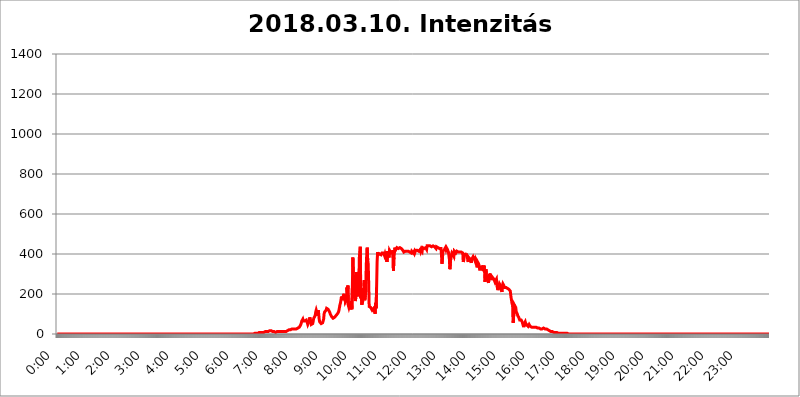
| Category | 2018.03.10. Intenzitás [W/m^2] |
|---|---|
| 0.0 | 0 |
| 0.0006944444444444445 | 0 |
| 0.001388888888888889 | 0 |
| 0.0020833333333333333 | 0 |
| 0.002777777777777778 | 0 |
| 0.003472222222222222 | 0 |
| 0.004166666666666667 | 0 |
| 0.004861111111111111 | 0 |
| 0.005555555555555556 | 0 |
| 0.0062499999999999995 | 0 |
| 0.006944444444444444 | 0 |
| 0.007638888888888889 | 0 |
| 0.008333333333333333 | 0 |
| 0.009027777777777779 | 0 |
| 0.009722222222222222 | 0 |
| 0.010416666666666666 | 0 |
| 0.011111111111111112 | 0 |
| 0.011805555555555555 | 0 |
| 0.012499999999999999 | 0 |
| 0.013194444444444444 | 0 |
| 0.013888888888888888 | 0 |
| 0.014583333333333332 | 0 |
| 0.015277777777777777 | 0 |
| 0.015972222222222224 | 0 |
| 0.016666666666666666 | 0 |
| 0.017361111111111112 | 0 |
| 0.018055555555555557 | 0 |
| 0.01875 | 0 |
| 0.019444444444444445 | 0 |
| 0.02013888888888889 | 0 |
| 0.020833333333333332 | 0 |
| 0.02152777777777778 | 0 |
| 0.022222222222222223 | 0 |
| 0.02291666666666667 | 0 |
| 0.02361111111111111 | 0 |
| 0.024305555555555556 | 0 |
| 0.024999999999999998 | 0 |
| 0.025694444444444447 | 0 |
| 0.02638888888888889 | 0 |
| 0.027083333333333334 | 0 |
| 0.027777777777777776 | 0 |
| 0.02847222222222222 | 0 |
| 0.029166666666666664 | 0 |
| 0.029861111111111113 | 0 |
| 0.030555555555555555 | 0 |
| 0.03125 | 0 |
| 0.03194444444444445 | 0 |
| 0.03263888888888889 | 0 |
| 0.03333333333333333 | 0 |
| 0.034027777777777775 | 0 |
| 0.034722222222222224 | 0 |
| 0.035416666666666666 | 0 |
| 0.036111111111111115 | 0 |
| 0.03680555555555556 | 0 |
| 0.0375 | 0 |
| 0.03819444444444444 | 0 |
| 0.03888888888888889 | 0 |
| 0.03958333333333333 | 0 |
| 0.04027777777777778 | 0 |
| 0.04097222222222222 | 0 |
| 0.041666666666666664 | 0 |
| 0.042361111111111106 | 0 |
| 0.04305555555555556 | 0 |
| 0.043750000000000004 | 0 |
| 0.044444444444444446 | 0 |
| 0.04513888888888889 | 0 |
| 0.04583333333333334 | 0 |
| 0.04652777777777778 | 0 |
| 0.04722222222222222 | 0 |
| 0.04791666666666666 | 0 |
| 0.04861111111111111 | 0 |
| 0.049305555555555554 | 0 |
| 0.049999999999999996 | 0 |
| 0.05069444444444445 | 0 |
| 0.051388888888888894 | 0 |
| 0.052083333333333336 | 0 |
| 0.05277777777777778 | 0 |
| 0.05347222222222222 | 0 |
| 0.05416666666666667 | 0 |
| 0.05486111111111111 | 0 |
| 0.05555555555555555 | 0 |
| 0.05625 | 0 |
| 0.05694444444444444 | 0 |
| 0.057638888888888885 | 0 |
| 0.05833333333333333 | 0 |
| 0.05902777777777778 | 0 |
| 0.059722222222222225 | 0 |
| 0.06041666666666667 | 0 |
| 0.061111111111111116 | 0 |
| 0.06180555555555556 | 0 |
| 0.0625 | 0 |
| 0.06319444444444444 | 0 |
| 0.06388888888888888 | 0 |
| 0.06458333333333334 | 0 |
| 0.06527777777777778 | 0 |
| 0.06597222222222222 | 0 |
| 0.06666666666666667 | 0 |
| 0.06736111111111111 | 0 |
| 0.06805555555555555 | 0 |
| 0.06874999999999999 | 0 |
| 0.06944444444444443 | 0 |
| 0.07013888888888889 | 0 |
| 0.07083333333333333 | 0 |
| 0.07152777777777779 | 0 |
| 0.07222222222222223 | 0 |
| 0.07291666666666667 | 0 |
| 0.07361111111111111 | 0 |
| 0.07430555555555556 | 0 |
| 0.075 | 0 |
| 0.07569444444444444 | 0 |
| 0.0763888888888889 | 0 |
| 0.07708333333333334 | 0 |
| 0.07777777777777778 | 0 |
| 0.07847222222222222 | 0 |
| 0.07916666666666666 | 0 |
| 0.0798611111111111 | 0 |
| 0.08055555555555556 | 0 |
| 0.08125 | 0 |
| 0.08194444444444444 | 0 |
| 0.08263888888888889 | 0 |
| 0.08333333333333333 | 0 |
| 0.08402777777777777 | 0 |
| 0.08472222222222221 | 0 |
| 0.08541666666666665 | 0 |
| 0.08611111111111112 | 0 |
| 0.08680555555555557 | 0 |
| 0.08750000000000001 | 0 |
| 0.08819444444444445 | 0 |
| 0.08888888888888889 | 0 |
| 0.08958333333333333 | 0 |
| 0.09027777777777778 | 0 |
| 0.09097222222222222 | 0 |
| 0.09166666666666667 | 0 |
| 0.09236111111111112 | 0 |
| 0.09305555555555556 | 0 |
| 0.09375 | 0 |
| 0.09444444444444444 | 0 |
| 0.09513888888888888 | 0 |
| 0.09583333333333333 | 0 |
| 0.09652777777777777 | 0 |
| 0.09722222222222222 | 0 |
| 0.09791666666666667 | 0 |
| 0.09861111111111111 | 0 |
| 0.09930555555555555 | 0 |
| 0.09999999999999999 | 0 |
| 0.10069444444444443 | 0 |
| 0.1013888888888889 | 0 |
| 0.10208333333333335 | 0 |
| 0.10277777777777779 | 0 |
| 0.10347222222222223 | 0 |
| 0.10416666666666667 | 0 |
| 0.10486111111111111 | 0 |
| 0.10555555555555556 | 0 |
| 0.10625 | 0 |
| 0.10694444444444444 | 0 |
| 0.1076388888888889 | 0 |
| 0.10833333333333334 | 0 |
| 0.10902777777777778 | 0 |
| 0.10972222222222222 | 0 |
| 0.1111111111111111 | 0 |
| 0.11180555555555556 | 0 |
| 0.11180555555555556 | 0 |
| 0.1125 | 0 |
| 0.11319444444444444 | 0 |
| 0.11388888888888889 | 0 |
| 0.11458333333333333 | 0 |
| 0.11527777777777777 | 0 |
| 0.11597222222222221 | 0 |
| 0.11666666666666665 | 0 |
| 0.1173611111111111 | 0 |
| 0.11805555555555557 | 0 |
| 0.11944444444444445 | 0 |
| 0.12013888888888889 | 0 |
| 0.12083333333333333 | 0 |
| 0.12152777777777778 | 0 |
| 0.12222222222222223 | 0 |
| 0.12291666666666667 | 0 |
| 0.12291666666666667 | 0 |
| 0.12361111111111112 | 0 |
| 0.12430555555555556 | 0 |
| 0.125 | 0 |
| 0.12569444444444444 | 0 |
| 0.12638888888888888 | 0 |
| 0.12708333333333333 | 0 |
| 0.16875 | 0 |
| 0.12847222222222224 | 0 |
| 0.12916666666666668 | 0 |
| 0.12986111111111112 | 0 |
| 0.13055555555555556 | 0 |
| 0.13125 | 0 |
| 0.13194444444444445 | 0 |
| 0.1326388888888889 | 0 |
| 0.13333333333333333 | 0 |
| 0.13402777777777777 | 0 |
| 0.13402777777777777 | 0 |
| 0.13472222222222222 | 0 |
| 0.13541666666666666 | 0 |
| 0.1361111111111111 | 0 |
| 0.13749999999999998 | 0 |
| 0.13819444444444443 | 0 |
| 0.1388888888888889 | 0 |
| 0.13958333333333334 | 0 |
| 0.14027777777777778 | 0 |
| 0.14097222222222222 | 0 |
| 0.14166666666666666 | 0 |
| 0.1423611111111111 | 0 |
| 0.14305555555555557 | 0 |
| 0.14375000000000002 | 0 |
| 0.14444444444444446 | 0 |
| 0.1451388888888889 | 0 |
| 0.1451388888888889 | 0 |
| 0.14652777777777778 | 0 |
| 0.14722222222222223 | 0 |
| 0.14791666666666667 | 0 |
| 0.1486111111111111 | 0 |
| 0.14930555555555555 | 0 |
| 0.15 | 0 |
| 0.15069444444444444 | 0 |
| 0.15138888888888888 | 0 |
| 0.15208333333333332 | 0 |
| 0.15277777777777776 | 0 |
| 0.15347222222222223 | 0 |
| 0.15416666666666667 | 0 |
| 0.15486111111111112 | 0 |
| 0.15555555555555556 | 0 |
| 0.15625 | 0 |
| 0.15694444444444444 | 0 |
| 0.15763888888888888 | 0 |
| 0.15833333333333333 | 0 |
| 0.15902777777777777 | 0 |
| 0.15972222222222224 | 0 |
| 0.16041666666666668 | 0 |
| 0.16111111111111112 | 0 |
| 0.16180555555555556 | 0 |
| 0.1625 | 0 |
| 0.16319444444444445 | 0 |
| 0.1638888888888889 | 0 |
| 0.16458333333333333 | 0 |
| 0.16527777777777777 | 0 |
| 0.16597222222222222 | 0 |
| 0.16666666666666666 | 0 |
| 0.1673611111111111 | 0 |
| 0.16805555555555554 | 0 |
| 0.16874999999999998 | 0 |
| 0.16944444444444443 | 0 |
| 0.17013888888888887 | 0 |
| 0.1708333333333333 | 0 |
| 0.17152777777777775 | 0 |
| 0.17222222222222225 | 0 |
| 0.1729166666666667 | 0 |
| 0.17361111111111113 | 0 |
| 0.17430555555555557 | 0 |
| 0.17500000000000002 | 0 |
| 0.17569444444444446 | 0 |
| 0.1763888888888889 | 0 |
| 0.17708333333333334 | 0 |
| 0.17777777777777778 | 0 |
| 0.17847222222222223 | 0 |
| 0.17916666666666667 | 0 |
| 0.1798611111111111 | 0 |
| 0.18055555555555555 | 0 |
| 0.18125 | 0 |
| 0.18194444444444444 | 0 |
| 0.1826388888888889 | 0 |
| 0.18333333333333335 | 0 |
| 0.1840277777777778 | 0 |
| 0.18472222222222223 | 0 |
| 0.18541666666666667 | 0 |
| 0.18611111111111112 | 0 |
| 0.18680555555555556 | 0 |
| 0.1875 | 0 |
| 0.18819444444444444 | 0 |
| 0.18888888888888888 | 0 |
| 0.18958333333333333 | 0 |
| 0.19027777777777777 | 0 |
| 0.1909722222222222 | 0 |
| 0.19166666666666665 | 0 |
| 0.19236111111111112 | 0 |
| 0.19305555555555554 | 0 |
| 0.19375 | 0 |
| 0.19444444444444445 | 0 |
| 0.1951388888888889 | 0 |
| 0.19583333333333333 | 0 |
| 0.19652777777777777 | 0 |
| 0.19722222222222222 | 0 |
| 0.19791666666666666 | 0 |
| 0.1986111111111111 | 0 |
| 0.19930555555555554 | 0 |
| 0.19999999999999998 | 0 |
| 0.20069444444444443 | 0 |
| 0.20138888888888887 | 0 |
| 0.2020833333333333 | 0 |
| 0.2027777777777778 | 0 |
| 0.2034722222222222 | 0 |
| 0.2041666666666667 | 0 |
| 0.20486111111111113 | 0 |
| 0.20555555555555557 | 0 |
| 0.20625000000000002 | 0 |
| 0.20694444444444446 | 0 |
| 0.2076388888888889 | 0 |
| 0.20833333333333334 | 0 |
| 0.20902777777777778 | 0 |
| 0.20972222222222223 | 0 |
| 0.21041666666666667 | 0 |
| 0.2111111111111111 | 0 |
| 0.21180555555555555 | 0 |
| 0.2125 | 0 |
| 0.21319444444444444 | 0 |
| 0.2138888888888889 | 0 |
| 0.21458333333333335 | 0 |
| 0.2152777777777778 | 0 |
| 0.21597222222222223 | 0 |
| 0.21666666666666667 | 0 |
| 0.21736111111111112 | 0 |
| 0.21805555555555556 | 0 |
| 0.21875 | 0 |
| 0.21944444444444444 | 0 |
| 0.22013888888888888 | 0 |
| 0.22083333333333333 | 0 |
| 0.22152777777777777 | 0 |
| 0.2222222222222222 | 0 |
| 0.22291666666666665 | 0 |
| 0.2236111111111111 | 0 |
| 0.22430555555555556 | 0 |
| 0.225 | 0 |
| 0.22569444444444445 | 0 |
| 0.2263888888888889 | 0 |
| 0.22708333333333333 | 0 |
| 0.22777777777777777 | 0 |
| 0.22847222222222222 | 0 |
| 0.22916666666666666 | 0 |
| 0.2298611111111111 | 0 |
| 0.23055555555555554 | 0 |
| 0.23124999999999998 | 0 |
| 0.23194444444444443 | 0 |
| 0.23263888888888887 | 0 |
| 0.2333333333333333 | 0 |
| 0.2340277777777778 | 0 |
| 0.2347222222222222 | 0 |
| 0.2354166666666667 | 0 |
| 0.23611111111111113 | 0 |
| 0.23680555555555557 | 0 |
| 0.23750000000000002 | 0 |
| 0.23819444444444446 | 0 |
| 0.2388888888888889 | 0 |
| 0.23958333333333334 | 0 |
| 0.24027777777777778 | 0 |
| 0.24097222222222223 | 0 |
| 0.24166666666666667 | 0 |
| 0.2423611111111111 | 0 |
| 0.24305555555555555 | 0 |
| 0.24375 | 0 |
| 0.24444444444444446 | 0 |
| 0.24513888888888888 | 0 |
| 0.24583333333333335 | 0 |
| 0.2465277777777778 | 0 |
| 0.24722222222222223 | 0 |
| 0.24791666666666667 | 0 |
| 0.24861111111111112 | 0 |
| 0.24930555555555556 | 0 |
| 0.25 | 0 |
| 0.25069444444444444 | 0 |
| 0.2513888888888889 | 0 |
| 0.2520833333333333 | 0 |
| 0.25277777777777777 | 0 |
| 0.2534722222222222 | 0 |
| 0.25416666666666665 | 0 |
| 0.2548611111111111 | 0 |
| 0.2555555555555556 | 0 |
| 0.25625000000000003 | 0 |
| 0.2569444444444445 | 0 |
| 0.2576388888888889 | 0 |
| 0.25833333333333336 | 0 |
| 0.2590277777777778 | 0 |
| 0.25972222222222224 | 0 |
| 0.2604166666666667 | 0 |
| 0.2611111111111111 | 0 |
| 0.26180555555555557 | 0 |
| 0.2625 | 0 |
| 0.26319444444444445 | 0 |
| 0.2638888888888889 | 0 |
| 0.26458333333333334 | 0 |
| 0.2652777777777778 | 0 |
| 0.2659722222222222 | 0 |
| 0.26666666666666666 | 0 |
| 0.2673611111111111 | 0 |
| 0.26805555555555555 | 0 |
| 0.26875 | 0 |
| 0.26944444444444443 | 0 |
| 0.2701388888888889 | 0 |
| 0.2708333333333333 | 0 |
| 0.27152777777777776 | 0 |
| 0.2722222222222222 | 0 |
| 0.27291666666666664 | 0 |
| 0.2736111111111111 | 0 |
| 0.2743055555555555 | 0 |
| 0.27499999999999997 | 0 |
| 0.27569444444444446 | 0 |
| 0.27638888888888885 | 3.525 |
| 0.27708333333333335 | 3.525 |
| 0.2777777777777778 | 3.525 |
| 0.27847222222222223 | 3.525 |
| 0.2791666666666667 | 3.525 |
| 0.2798611111111111 | 3.525 |
| 0.28055555555555556 | 3.525 |
| 0.28125 | 3.525 |
| 0.28194444444444444 | 3.525 |
| 0.2826388888888889 | 3.525 |
| 0.2833333333333333 | 7.887 |
| 0.28402777777777777 | 3.525 |
| 0.2847222222222222 | 7.887 |
| 0.28541666666666665 | 7.887 |
| 0.28611111111111115 | 7.887 |
| 0.28680555555555554 | 7.887 |
| 0.28750000000000003 | 7.887 |
| 0.2881944444444445 | 7.887 |
| 0.2888888888888889 | 7.887 |
| 0.28958333333333336 | 7.887 |
| 0.2902777777777778 | 7.887 |
| 0.29097222222222224 | 12.257 |
| 0.2916666666666667 | 12.257 |
| 0.2923611111111111 | 7.887 |
| 0.29305555555555557 | 12.257 |
| 0.29375 | 12.257 |
| 0.29444444444444445 | 12.257 |
| 0.2951388888888889 | 12.257 |
| 0.29583333333333334 | 12.257 |
| 0.2965277777777778 | 12.257 |
| 0.2972222222222222 | 16.636 |
| 0.29791666666666666 | 16.636 |
| 0.2986111111111111 | 16.636 |
| 0.29930555555555555 | 16.636 |
| 0.3 | 16.636 |
| 0.30069444444444443 | 16.636 |
| 0.3013888888888889 | 12.257 |
| 0.3020833333333333 | 12.257 |
| 0.30277777777777776 | 12.257 |
| 0.3034722222222222 | 12.257 |
| 0.30416666666666664 | 12.257 |
| 0.3048611111111111 | 7.887 |
| 0.3055555555555555 | 7.887 |
| 0.30624999999999997 | 7.887 |
| 0.3069444444444444 | 7.887 |
| 0.3076388888888889 | 7.887 |
| 0.30833333333333335 | 12.257 |
| 0.3090277777777778 | 12.257 |
| 0.30972222222222223 | 12.257 |
| 0.3104166666666667 | 12.257 |
| 0.3111111111111111 | 12.257 |
| 0.31180555555555556 | 12.257 |
| 0.3125 | 12.257 |
| 0.31319444444444444 | 12.257 |
| 0.3138888888888889 | 12.257 |
| 0.3145833333333333 | 12.257 |
| 0.31527777777777777 | 12.257 |
| 0.3159722222222222 | 12.257 |
| 0.31666666666666665 | 12.257 |
| 0.31736111111111115 | 12.257 |
| 0.31805555555555554 | 12.257 |
| 0.31875000000000003 | 12.257 |
| 0.3194444444444445 | 12.257 |
| 0.3201388888888889 | 12.257 |
| 0.32083333333333336 | 12.257 |
| 0.3215277777777778 | 16.636 |
| 0.32222222222222224 | 16.636 |
| 0.3229166666666667 | 16.636 |
| 0.3236111111111111 | 16.636 |
| 0.32430555555555557 | 21.024 |
| 0.325 | 21.024 |
| 0.32569444444444445 | 21.024 |
| 0.3263888888888889 | 21.024 |
| 0.32708333333333334 | 21.024 |
| 0.3277777777777778 | 21.024 |
| 0.3284722222222222 | 21.024 |
| 0.32916666666666666 | 25.419 |
| 0.3298611111111111 | 21.024 |
| 0.33055555555555555 | 21.024 |
| 0.33125 | 25.419 |
| 0.33194444444444443 | 25.419 |
| 0.3326388888888889 | 25.419 |
| 0.3333333333333333 | 25.419 |
| 0.3340277777777778 | 25.419 |
| 0.3347222222222222 | 25.419 |
| 0.3354166666666667 | 25.419 |
| 0.3361111111111111 | 25.419 |
| 0.3368055555555556 | 25.419 |
| 0.33749999999999997 | 29.823 |
| 0.33819444444444446 | 29.823 |
| 0.33888888888888885 | 34.234 |
| 0.33958333333333335 | 34.234 |
| 0.34027777777777773 | 38.653 |
| 0.34097222222222223 | 38.653 |
| 0.3416666666666666 | 47.511 |
| 0.3423611111111111 | 56.398 |
| 0.3430555555555555 | 65.31 |
| 0.34375 | 69.775 |
| 0.3444444444444445 | 74.246 |
| 0.3451388888888889 | 65.31 |
| 0.3458333333333334 | 69.775 |
| 0.34652777777777777 | 65.31 |
| 0.34722222222222227 | 65.31 |
| 0.34791666666666665 | 65.31 |
| 0.34861111111111115 | 69.775 |
| 0.34930555555555554 | 69.775 |
| 0.35000000000000003 | 74.246 |
| 0.3506944444444444 | 56.398 |
| 0.3513888888888889 | 47.511 |
| 0.3520833333333333 | 47.511 |
| 0.3527777777777778 | 47.511 |
| 0.3534722222222222 | 65.31 |
| 0.3541666666666667 | 83.205 |
| 0.3548611111111111 | 78.722 |
| 0.35555555555555557 | 60.85 |
| 0.35625 | 47.511 |
| 0.35694444444444445 | 47.511 |
| 0.3576388888888889 | 51.951 |
| 0.35833333333333334 | 51.951 |
| 0.3590277777777778 | 65.31 |
| 0.3597222222222222 | 78.722 |
| 0.36041666666666666 | 78.722 |
| 0.3611111111111111 | 83.205 |
| 0.36180555555555555 | 92.184 |
| 0.3625 | 110.201 |
| 0.36319444444444443 | 119.235 |
| 0.3638888888888889 | 123.758 |
| 0.3645833333333333 | 119.235 |
| 0.3652777777777778 | 92.184 |
| 0.3659722222222222 | 119.235 |
| 0.3666666666666667 | 101.184 |
| 0.3673611111111111 | 74.246 |
| 0.3680555555555556 | 60.85 |
| 0.36874999999999997 | 56.398 |
| 0.36944444444444446 | 56.398 |
| 0.37013888888888885 | 51.951 |
| 0.37083333333333335 | 51.951 |
| 0.37152777777777773 | 51.951 |
| 0.37222222222222223 | 56.398 |
| 0.3729166666666666 | 65.31 |
| 0.3736111111111111 | 74.246 |
| 0.3743055555555555 | 101.184 |
| 0.375 | 110.201 |
| 0.3756944444444445 | 114.716 |
| 0.3763888888888889 | 114.716 |
| 0.3770833333333334 | 119.235 |
| 0.37777777777777777 | 128.284 |
| 0.37847222222222227 | 128.284 |
| 0.37916666666666665 | 123.758 |
| 0.37986111111111115 | 123.758 |
| 0.38055555555555554 | 119.235 |
| 0.38125000000000003 | 119.235 |
| 0.3819444444444444 | 110.201 |
| 0.3826388888888889 | 105.69 |
| 0.3833333333333333 | 96.682 |
| 0.3840277777777778 | 92.184 |
| 0.3847222222222222 | 87.692 |
| 0.3854166666666667 | 83.205 |
| 0.3861111111111111 | 83.205 |
| 0.38680555555555557 | 78.722 |
| 0.3875 | 78.722 |
| 0.38819444444444445 | 78.722 |
| 0.3888888888888889 | 83.205 |
| 0.38958333333333334 | 87.692 |
| 0.3902777777777778 | 87.692 |
| 0.3909722222222222 | 92.184 |
| 0.39166666666666666 | 96.682 |
| 0.3923611111111111 | 96.682 |
| 0.39305555555555555 | 101.184 |
| 0.39375 | 105.69 |
| 0.39444444444444443 | 110.201 |
| 0.3951388888888889 | 119.235 |
| 0.3958333333333333 | 132.814 |
| 0.3965277777777778 | 146.423 |
| 0.3972222222222222 | 155.509 |
| 0.3979166666666667 | 169.156 |
| 0.3986111111111111 | 187.378 |
| 0.3993055555555556 | 187.378 |
| 0.39999999999999997 | 169.156 |
| 0.40069444444444446 | 173.709 |
| 0.40138888888888885 | 191.937 |
| 0.40208333333333335 | 201.058 |
| 0.40277777777777773 | 173.709 |
| 0.40347222222222223 | 191.937 |
| 0.4041666666666666 | 160.056 |
| 0.4048611111111111 | 160.056 |
| 0.4055555555555555 | 169.156 |
| 0.40625 | 233 |
| 0.4069444444444445 | 210.182 |
| 0.4076388888888889 | 242.127 |
| 0.4083333333333334 | 141.884 |
| 0.40902777777777777 | 132.814 |
| 0.40972222222222227 | 137.347 |
| 0.41041666666666665 | 150.964 |
| 0.41111111111111115 | 123.758 |
| 0.41180555555555554 | 119.235 |
| 0.41250000000000003 | 164.605 |
| 0.4131944444444444 | 123.758 |
| 0.4138888888888889 | 228.436 |
| 0.4145833333333333 | 382.715 |
| 0.4152777777777778 | 301.354 |
| 0.4159722222222222 | 269.49 |
| 0.4166666666666667 | 178.264 |
| 0.4173611111111111 | 223.873 |
| 0.41805555555555557 | 164.605 |
| 0.41875 | 182.82 |
| 0.41944444444444445 | 310.44 |
| 0.4201388888888889 | 251.251 |
| 0.42083333333333334 | 187.378 |
| 0.4215277777777778 | 242.127 |
| 0.4222222222222222 | 191.937 |
| 0.42291666666666666 | 214.746 |
| 0.4236111111111111 | 378.224 |
| 0.42430555555555555 | 409.574 |
| 0.425 | 436.27 |
| 0.42569444444444443 | 178.264 |
| 0.4263888888888889 | 228.436 |
| 0.4270833333333333 | 146.423 |
| 0.4277777777777778 | 146.423 |
| 0.4284722222222222 | 164.605 |
| 0.4291666666666667 | 169.156 |
| 0.4298611111111111 | 201.058 |
| 0.4305555555555556 | 269.49 |
| 0.43124999999999997 | 169.156 |
| 0.43194444444444446 | 169.156 |
| 0.43263888888888885 | 210.182 |
| 0.43333333333333335 | 337.639 |
| 0.43402777777777773 | 396.164 |
| 0.43472222222222223 | 431.833 |
| 0.4354166666666666 | 369.23 |
| 0.4361111111111111 | 351.198 |
| 0.4368055555555555 | 255.813 |
| 0.4375 | 137.347 |
| 0.4381944444444445 | 141.884 |
| 0.4388888888888889 | 137.347 |
| 0.4395833333333334 | 132.814 |
| 0.44027777777777777 | 128.284 |
| 0.44097222222222227 | 128.284 |
| 0.44166666666666665 | 119.235 |
| 0.44236111111111115 | 119.235 |
| 0.44305555555555554 | 119.235 |
| 0.44375000000000003 | 128.284 |
| 0.4444444444444444 | 119.235 |
| 0.4451388888888889 | 110.201 |
| 0.4458333333333333 | 101.184 |
| 0.4465277777777778 | 155.509 |
| 0.4472222222222222 | 128.284 |
| 0.4479166666666667 | 233 |
| 0.4486111111111111 | 360.221 |
| 0.44930555555555557 | 409.574 |
| 0.45 | 396.164 |
| 0.45069444444444445 | 400.638 |
| 0.4513888888888889 | 391.685 |
| 0.45208333333333334 | 400.638 |
| 0.4527777777777778 | 396.164 |
| 0.4534722222222222 | 396.164 |
| 0.45416666666666666 | 396.164 |
| 0.4548611111111111 | 400.638 |
| 0.45555555555555555 | 405.108 |
| 0.45625 | 405.108 |
| 0.45694444444444443 | 405.108 |
| 0.4576388888888889 | 405.108 |
| 0.4583333333333333 | 400.638 |
| 0.4590277777777778 | 391.685 |
| 0.4597222222222222 | 400.638 |
| 0.4604166666666667 | 391.685 |
| 0.4611111111111111 | 405.108 |
| 0.4618055555555556 | 409.574 |
| 0.46249999999999997 | 360.221 |
| 0.46319444444444446 | 414.035 |
| 0.46388888888888885 | 414.035 |
| 0.46458333333333335 | 409.574 |
| 0.46527777777777773 | 382.715 |
| 0.46597222222222223 | 418.492 |
| 0.4666666666666666 | 418.492 |
| 0.4673611111111111 | 414.035 |
| 0.4680555555555555 | 405.108 |
| 0.46875 | 405.108 |
| 0.4694444444444445 | 409.574 |
| 0.4701388888888889 | 405.108 |
| 0.4708333333333334 | 418.492 |
| 0.47152777777777777 | 314.98 |
| 0.47222222222222227 | 382.715 |
| 0.47291666666666665 | 409.574 |
| 0.47361111111111115 | 431.833 |
| 0.47430555555555554 | 418.492 |
| 0.47500000000000003 | 422.943 |
| 0.4756944444444444 | 418.492 |
| 0.4763888888888889 | 431.833 |
| 0.4770833333333333 | 427.39 |
| 0.4777777777777778 | 427.39 |
| 0.4784722222222222 | 427.39 |
| 0.4791666666666667 | 427.39 |
| 0.4798611111111111 | 427.39 |
| 0.48055555555555557 | 431.833 |
| 0.48125 | 427.39 |
| 0.48194444444444445 | 427.39 |
| 0.4826388888888889 | 427.39 |
| 0.48333333333333334 | 422.943 |
| 0.4840277777777778 | 422.943 |
| 0.4847222222222222 | 418.492 |
| 0.48541666666666666 | 418.492 |
| 0.4861111111111111 | 409.574 |
| 0.48680555555555555 | 414.035 |
| 0.4875 | 409.574 |
| 0.48819444444444443 | 414.035 |
| 0.4888888888888889 | 418.492 |
| 0.4895833333333333 | 409.574 |
| 0.4902777777777778 | 414.035 |
| 0.4909722222222222 | 409.574 |
| 0.4916666666666667 | 414.035 |
| 0.4923611111111111 | 414.035 |
| 0.4930555555555556 | 414.035 |
| 0.49374999999999997 | 414.035 |
| 0.49444444444444446 | 409.574 |
| 0.49513888888888885 | 414.035 |
| 0.49583333333333335 | 405.108 |
| 0.49652777777777773 | 405.108 |
| 0.49722222222222223 | 414.035 |
| 0.4979166666666666 | 414.035 |
| 0.4986111111111111 | 414.035 |
| 0.4993055555555555 | 405.108 |
| 0.5 | 405.108 |
| 0.5006944444444444 | 414.035 |
| 0.5013888888888889 | 405.108 |
| 0.5020833333333333 | 405.108 |
| 0.5027777777777778 | 418.492 |
| 0.5034722222222222 | 422.943 |
| 0.5041666666666667 | 418.492 |
| 0.5048611111111111 | 418.492 |
| 0.5055555555555555 | 418.492 |
| 0.50625 | 414.035 |
| 0.5069444444444444 | 414.035 |
| 0.5076388888888889 | 418.492 |
| 0.5083333333333333 | 414.035 |
| 0.5090277777777777 | 422.943 |
| 0.5097222222222222 | 414.035 |
| 0.5104166666666666 | 422.943 |
| 0.5111111111111112 | 427.39 |
| 0.5118055555555555 | 414.035 |
| 0.5125000000000001 | 431.833 |
| 0.5131944444444444 | 427.39 |
| 0.513888888888889 | 431.833 |
| 0.5145833333333333 | 427.39 |
| 0.5152777777777778 | 422.943 |
| 0.5159722222222222 | 427.39 |
| 0.5166666666666667 | 431.833 |
| 0.517361111111111 | 427.39 |
| 0.5180555555555556 | 422.943 |
| 0.5187499999999999 | 440.702 |
| 0.5194444444444445 | 445.129 |
| 0.5201388888888888 | 445.129 |
| 0.5208333333333334 | 440.702 |
| 0.5215277777777778 | 440.702 |
| 0.5222222222222223 | 440.702 |
| 0.5229166666666667 | 440.702 |
| 0.5236111111111111 | 440.702 |
| 0.5243055555555556 | 440.702 |
| 0.525 | 436.27 |
| 0.5256944444444445 | 440.702 |
| 0.5263888888888889 | 440.702 |
| 0.5270833333333333 | 440.702 |
| 0.5277777777777778 | 440.702 |
| 0.5284722222222222 | 440.702 |
| 0.5291666666666667 | 436.27 |
| 0.5298611111111111 | 436.27 |
| 0.5305555555555556 | 431.833 |
| 0.53125 | 427.39 |
| 0.5319444444444444 | 436.27 |
| 0.5326388888888889 | 431.833 |
| 0.5333333333333333 | 431.833 |
| 0.5340277777777778 | 431.833 |
| 0.5347222222222222 | 427.39 |
| 0.5354166666666667 | 427.39 |
| 0.5361111111111111 | 427.39 |
| 0.5368055555555555 | 431.833 |
| 0.5375 | 427.39 |
| 0.5381944444444444 | 427.39 |
| 0.5388888888888889 | 396.164 |
| 0.5395833333333333 | 351.198 |
| 0.5402777777777777 | 378.224 |
| 0.5409722222222222 | 414.035 |
| 0.5416666666666666 | 414.035 |
| 0.5423611111111112 | 418.492 |
| 0.5430555555555555 | 422.943 |
| 0.5437500000000001 | 427.39 |
| 0.5444444444444444 | 431.833 |
| 0.545138888888889 | 422.943 |
| 0.5458333333333333 | 431.833 |
| 0.5465277777777778 | 427.39 |
| 0.5472222222222222 | 422.943 |
| 0.5479166666666667 | 427.39 |
| 0.548611111111111 | 409.574 |
| 0.5493055555555556 | 405.108 |
| 0.5499999999999999 | 373.729 |
| 0.5506944444444445 | 324.052 |
| 0.5513888888888888 | 328.584 |
| 0.5520833333333334 | 387.202 |
| 0.5527777777777778 | 396.164 |
| 0.5534722222222223 | 405.108 |
| 0.5541666666666667 | 400.638 |
| 0.5548611111111111 | 396.164 |
| 0.5555555555555556 | 391.685 |
| 0.55625 | 387.202 |
| 0.5569444444444445 | 414.035 |
| 0.5576388888888889 | 414.035 |
| 0.5583333333333333 | 409.574 |
| 0.5590277777777778 | 405.108 |
| 0.5597222222222222 | 405.108 |
| 0.5604166666666667 | 414.035 |
| 0.5611111111111111 | 414.035 |
| 0.5618055555555556 | 414.035 |
| 0.5625 | 409.574 |
| 0.5631944444444444 | 409.574 |
| 0.5638888888888889 | 409.574 |
| 0.5645833333333333 | 409.574 |
| 0.5652777777777778 | 405.108 |
| 0.5659722222222222 | 405.108 |
| 0.5666666666666667 | 409.574 |
| 0.5673611111111111 | 409.574 |
| 0.5680555555555555 | 405.108 |
| 0.56875 | 405.108 |
| 0.5694444444444444 | 360.221 |
| 0.5701388888888889 | 369.23 |
| 0.5708333333333333 | 373.729 |
| 0.5715277777777777 | 405.108 |
| 0.5722222222222222 | 396.164 |
| 0.5729166666666666 | 396.164 |
| 0.5736111111111112 | 400.638 |
| 0.5743055555555555 | 396.164 |
| 0.5750000000000001 | 396.164 |
| 0.5756944444444444 | 396.164 |
| 0.576388888888889 | 360.221 |
| 0.5770833333333333 | 382.715 |
| 0.5777777777777778 | 387.202 |
| 0.5784722222222222 | 378.224 |
| 0.5791666666666667 | 373.729 |
| 0.579861111111111 | 369.23 |
| 0.5805555555555556 | 355.712 |
| 0.5812499999999999 | 369.23 |
| 0.5819444444444445 | 378.224 |
| 0.5826388888888888 | 382.715 |
| 0.5833333333333334 | 387.202 |
| 0.5840277777777778 | 382.715 |
| 0.5847222222222223 | 378.224 |
| 0.5854166666666667 | 373.729 |
| 0.5861111111111111 | 364.728 |
| 0.5868055555555556 | 373.729 |
| 0.5875 | 373.729 |
| 0.5881944444444445 | 360.221 |
| 0.5888888888888889 | 333.113 |
| 0.5895833333333333 | 360.221 |
| 0.5902777777777778 | 360.221 |
| 0.5909722222222222 | 351.198 |
| 0.5916666666666667 | 342.162 |
| 0.5923611111111111 | 324.052 |
| 0.5930555555555556 | 328.584 |
| 0.59375 | 328.584 |
| 0.5944444444444444 | 324.052 |
| 0.5951388888888889 | 342.162 |
| 0.5958333333333333 | 342.162 |
| 0.5965277777777778 | 328.584 |
| 0.5972222222222222 | 324.052 |
| 0.5979166666666667 | 314.98 |
| 0.5986111111111111 | 342.162 |
| 0.5993055555555555 | 314.98 |
| 0.6 | 260.373 |
| 0.6006944444444444 | 314.98 |
| 0.6013888888888889 | 324.052 |
| 0.6020833333333333 | 278.603 |
| 0.6027777777777777 | 283.156 |
| 0.6034722222222222 | 269.49 |
| 0.6041666666666666 | 264.932 |
| 0.6048611111111112 | 255.813 |
| 0.6055555555555555 | 278.603 |
| 0.6062500000000001 | 301.354 |
| 0.6069444444444444 | 287.709 |
| 0.607638888888889 | 301.354 |
| 0.6083333333333333 | 274.047 |
| 0.6090277777777778 | 287.709 |
| 0.6097222222222222 | 269.49 |
| 0.6104166666666667 | 283.156 |
| 0.611111111111111 | 278.603 |
| 0.6118055555555556 | 283.156 |
| 0.6124999999999999 | 274.047 |
| 0.6131944444444445 | 269.49 |
| 0.6138888888888888 | 260.373 |
| 0.6145833333333334 | 260.373 |
| 0.6152777777777778 | 260.373 |
| 0.6159722222222223 | 274.047 |
| 0.6166666666666667 | 242.127 |
| 0.6173611111111111 | 242.127 |
| 0.6180555555555556 | 219.309 |
| 0.61875 | 233 |
| 0.6194444444444445 | 242.127 |
| 0.6201388888888889 | 251.251 |
| 0.6208333333333333 | 255.813 |
| 0.6215277777777778 | 242.127 |
| 0.6222222222222222 | 246.689 |
| 0.6229166666666667 | 246.689 |
| 0.6236111111111111 | 210.182 |
| 0.6243055555555556 | 242.127 |
| 0.625 | 251.251 |
| 0.6256944444444444 | 246.689 |
| 0.6263888888888889 | 242.127 |
| 0.6270833333333333 | 233 |
| 0.6277777777777778 | 228.436 |
| 0.6284722222222222 | 228.436 |
| 0.6291666666666667 | 233 |
| 0.6298611111111111 | 228.436 |
| 0.6305555555555555 | 228.436 |
| 0.63125 | 228.436 |
| 0.6319444444444444 | 228.436 |
| 0.6326388888888889 | 228.436 |
| 0.6333333333333333 | 223.873 |
| 0.6340277777777777 | 219.309 |
| 0.6347222222222222 | 219.309 |
| 0.6354166666666666 | 214.746 |
| 0.6361111111111112 | 191.937 |
| 0.6368055555555555 | 187.378 |
| 0.6375000000000001 | 160.056 |
| 0.6381944444444444 | 146.423 |
| 0.638888888888889 | 155.509 |
| 0.6395833333333333 | 56.398 |
| 0.6402777777777778 | 56.398 |
| 0.6409722222222222 | 146.423 |
| 0.6416666666666667 | 150.964 |
| 0.642361111111111 | 146.423 |
| 0.6430555555555556 | 132.814 |
| 0.6437499999999999 | 110.201 |
| 0.6444444444444445 | 110.201 |
| 0.6451388888888888 | 101.184 |
| 0.6458333333333334 | 92.184 |
| 0.6465277777777778 | 92.184 |
| 0.6472222222222223 | 83.205 |
| 0.6479166666666667 | 78.722 |
| 0.6486111111111111 | 69.775 |
| 0.6493055555555556 | 69.775 |
| 0.65 | 65.31 |
| 0.6506944444444445 | 69.775 |
| 0.6513888888888889 | 65.31 |
| 0.6520833333333333 | 60.85 |
| 0.6527777777777778 | 51.951 |
| 0.6534722222222222 | 51.951 |
| 0.6541666666666667 | 34.234 |
| 0.6548611111111111 | 51.951 |
| 0.6555555555555556 | 47.511 |
| 0.65625 | 60.85 |
| 0.6569444444444444 | 60.85 |
| 0.6576388888888889 | 38.653 |
| 0.6583333333333333 | 47.511 |
| 0.6590277777777778 | 47.511 |
| 0.6597222222222222 | 51.951 |
| 0.6604166666666667 | 38.653 |
| 0.6611111111111111 | 43.079 |
| 0.6618055555555555 | 47.511 |
| 0.6625 | 43.079 |
| 0.6631944444444444 | 38.653 |
| 0.6638888888888889 | 34.234 |
| 0.6645833333333333 | 34.234 |
| 0.6652777777777777 | 34.234 |
| 0.6659722222222222 | 34.234 |
| 0.6666666666666666 | 34.234 |
| 0.6673611111111111 | 34.234 |
| 0.6680555555555556 | 34.234 |
| 0.6687500000000001 | 34.234 |
| 0.6694444444444444 | 34.234 |
| 0.6701388888888888 | 34.234 |
| 0.6708333333333334 | 34.234 |
| 0.6715277777777778 | 34.234 |
| 0.6722222222222222 | 34.234 |
| 0.6729166666666666 | 34.234 |
| 0.6736111111111112 | 29.823 |
| 0.6743055555555556 | 29.823 |
| 0.6749999999999999 | 29.823 |
| 0.6756944444444444 | 29.823 |
| 0.6763888888888889 | 29.823 |
| 0.6770833333333334 | 25.419 |
| 0.6777777777777777 | 25.419 |
| 0.6784722222222223 | 25.419 |
| 0.6791666666666667 | 25.419 |
| 0.6798611111111111 | 25.419 |
| 0.6805555555555555 | 25.419 |
| 0.68125 | 29.823 |
| 0.6819444444444445 | 29.823 |
| 0.6826388888888889 | 25.419 |
| 0.6833333333333332 | 25.419 |
| 0.6840277777777778 | 25.419 |
| 0.6847222222222222 | 25.419 |
| 0.6854166666666667 | 25.419 |
| 0.686111111111111 | 25.419 |
| 0.6868055555555556 | 21.024 |
| 0.6875 | 21.024 |
| 0.6881944444444444 | 21.024 |
| 0.688888888888889 | 16.636 |
| 0.6895833333333333 | 16.636 |
| 0.6902777777777778 | 16.636 |
| 0.6909722222222222 | 12.257 |
| 0.6916666666666668 | 12.257 |
| 0.6923611111111111 | 12.257 |
| 0.6930555555555555 | 12.257 |
| 0.69375 | 12.257 |
| 0.6944444444444445 | 12.257 |
| 0.6951388888888889 | 7.887 |
| 0.6958333333333333 | 7.887 |
| 0.6965277777777777 | 7.887 |
| 0.6972222222222223 | 7.887 |
| 0.6979166666666666 | 7.887 |
| 0.6986111111111111 | 7.887 |
| 0.6993055555555556 | 7.887 |
| 0.7000000000000001 | 7.887 |
| 0.7006944444444444 | 7.887 |
| 0.7013888888888888 | 3.525 |
| 0.7020833333333334 | 7.887 |
| 0.7027777777777778 | 3.525 |
| 0.7034722222222222 | 3.525 |
| 0.7041666666666666 | 3.525 |
| 0.7048611111111112 | 3.525 |
| 0.7055555555555556 | 3.525 |
| 0.7062499999999999 | 3.525 |
| 0.7069444444444444 | 3.525 |
| 0.7076388888888889 | 3.525 |
| 0.7083333333333334 | 3.525 |
| 0.7090277777777777 | 3.525 |
| 0.7097222222222223 | 3.525 |
| 0.7104166666666667 | 3.525 |
| 0.7111111111111111 | 3.525 |
| 0.7118055555555555 | 3.525 |
| 0.7125 | 3.525 |
| 0.7131944444444445 | 3.525 |
| 0.7138888888888889 | 3.525 |
| 0.7145833333333332 | 0 |
| 0.7152777777777778 | 3.525 |
| 0.7159722222222222 | 0 |
| 0.7166666666666667 | 0 |
| 0.717361111111111 | 0 |
| 0.7180555555555556 | 0 |
| 0.71875 | 0 |
| 0.7194444444444444 | 0 |
| 0.720138888888889 | 0 |
| 0.7208333333333333 | 0 |
| 0.7215277777777778 | 0 |
| 0.7222222222222222 | 0 |
| 0.7229166666666668 | 0 |
| 0.7236111111111111 | 0 |
| 0.7243055555555555 | 0 |
| 0.725 | 0 |
| 0.7256944444444445 | 0 |
| 0.7263888888888889 | 0 |
| 0.7270833333333333 | 0 |
| 0.7277777777777777 | 0 |
| 0.7284722222222223 | 0 |
| 0.7291666666666666 | 0 |
| 0.7298611111111111 | 0 |
| 0.7305555555555556 | 0 |
| 0.7312500000000001 | 0 |
| 0.7319444444444444 | 0 |
| 0.7326388888888888 | 0 |
| 0.7333333333333334 | 0 |
| 0.7340277777777778 | 0 |
| 0.7347222222222222 | 0 |
| 0.7354166666666666 | 0 |
| 0.7361111111111112 | 0 |
| 0.7368055555555556 | 0 |
| 0.7374999999999999 | 0 |
| 0.7381944444444444 | 0 |
| 0.7388888888888889 | 0 |
| 0.7395833333333334 | 0 |
| 0.7402777777777777 | 0 |
| 0.7409722222222223 | 0 |
| 0.7416666666666667 | 0 |
| 0.7423611111111111 | 0 |
| 0.7430555555555555 | 0 |
| 0.74375 | 0 |
| 0.7444444444444445 | 0 |
| 0.7451388888888889 | 0 |
| 0.7458333333333332 | 0 |
| 0.7465277777777778 | 0 |
| 0.7472222222222222 | 0 |
| 0.7479166666666667 | 0 |
| 0.748611111111111 | 0 |
| 0.7493055555555556 | 0 |
| 0.75 | 0 |
| 0.7506944444444444 | 0 |
| 0.751388888888889 | 0 |
| 0.7520833333333333 | 0 |
| 0.7527777777777778 | 0 |
| 0.7534722222222222 | 0 |
| 0.7541666666666668 | 0 |
| 0.7548611111111111 | 0 |
| 0.7555555555555555 | 0 |
| 0.75625 | 0 |
| 0.7569444444444445 | 0 |
| 0.7576388888888889 | 0 |
| 0.7583333333333333 | 0 |
| 0.7590277777777777 | 0 |
| 0.7597222222222223 | 0 |
| 0.7604166666666666 | 0 |
| 0.7611111111111111 | 0 |
| 0.7618055555555556 | 0 |
| 0.7625000000000001 | 0 |
| 0.7631944444444444 | 0 |
| 0.7638888888888888 | 0 |
| 0.7645833333333334 | 0 |
| 0.7652777777777778 | 0 |
| 0.7659722222222222 | 0 |
| 0.7666666666666666 | 0 |
| 0.7673611111111112 | 0 |
| 0.7680555555555556 | 0 |
| 0.7687499999999999 | 0 |
| 0.7694444444444444 | 0 |
| 0.7701388888888889 | 0 |
| 0.7708333333333334 | 0 |
| 0.7715277777777777 | 0 |
| 0.7722222222222223 | 0 |
| 0.7729166666666667 | 0 |
| 0.7736111111111111 | 0 |
| 0.7743055555555555 | 0 |
| 0.775 | 0 |
| 0.7756944444444445 | 0 |
| 0.7763888888888889 | 0 |
| 0.7770833333333332 | 0 |
| 0.7777777777777778 | 0 |
| 0.7784722222222222 | 0 |
| 0.7791666666666667 | 0 |
| 0.779861111111111 | 0 |
| 0.7805555555555556 | 0 |
| 0.78125 | 0 |
| 0.7819444444444444 | 0 |
| 0.782638888888889 | 0 |
| 0.7833333333333333 | 0 |
| 0.7840277777777778 | 0 |
| 0.7847222222222222 | 0 |
| 0.7854166666666668 | 0 |
| 0.7861111111111111 | 0 |
| 0.7868055555555555 | 0 |
| 0.7875 | 0 |
| 0.7881944444444445 | 0 |
| 0.7888888888888889 | 0 |
| 0.7895833333333333 | 0 |
| 0.7902777777777777 | 0 |
| 0.7909722222222223 | 0 |
| 0.7916666666666666 | 0 |
| 0.7923611111111111 | 0 |
| 0.7930555555555556 | 0 |
| 0.7937500000000001 | 0 |
| 0.7944444444444444 | 0 |
| 0.7951388888888888 | 0 |
| 0.7958333333333334 | 0 |
| 0.7965277777777778 | 0 |
| 0.7972222222222222 | 0 |
| 0.7979166666666666 | 0 |
| 0.7986111111111112 | 0 |
| 0.7993055555555556 | 0 |
| 0.7999999999999999 | 0 |
| 0.8006944444444444 | 0 |
| 0.8013888888888889 | 0 |
| 0.8020833333333334 | 0 |
| 0.8027777777777777 | 0 |
| 0.8034722222222223 | 0 |
| 0.8041666666666667 | 0 |
| 0.8048611111111111 | 0 |
| 0.8055555555555555 | 0 |
| 0.80625 | 0 |
| 0.8069444444444445 | 0 |
| 0.8076388888888889 | 0 |
| 0.8083333333333332 | 0 |
| 0.8090277777777778 | 0 |
| 0.8097222222222222 | 0 |
| 0.8104166666666667 | 0 |
| 0.811111111111111 | 0 |
| 0.8118055555555556 | 0 |
| 0.8125 | 0 |
| 0.8131944444444444 | 0 |
| 0.813888888888889 | 0 |
| 0.8145833333333333 | 0 |
| 0.8152777777777778 | 0 |
| 0.8159722222222222 | 0 |
| 0.8166666666666668 | 0 |
| 0.8173611111111111 | 0 |
| 0.8180555555555555 | 0 |
| 0.81875 | 0 |
| 0.8194444444444445 | 0 |
| 0.8201388888888889 | 0 |
| 0.8208333333333333 | 0 |
| 0.8215277777777777 | 0 |
| 0.8222222222222223 | 0 |
| 0.8229166666666666 | 0 |
| 0.8236111111111111 | 0 |
| 0.8243055555555556 | 0 |
| 0.8250000000000001 | 0 |
| 0.8256944444444444 | 0 |
| 0.8263888888888888 | 0 |
| 0.8270833333333334 | 0 |
| 0.8277777777777778 | 0 |
| 0.8284722222222222 | 0 |
| 0.8291666666666666 | 0 |
| 0.8298611111111112 | 0 |
| 0.8305555555555556 | 0 |
| 0.8312499999999999 | 0 |
| 0.8319444444444444 | 0 |
| 0.8326388888888889 | 0 |
| 0.8333333333333334 | 0 |
| 0.8340277777777777 | 0 |
| 0.8347222222222223 | 0 |
| 0.8354166666666667 | 0 |
| 0.8361111111111111 | 0 |
| 0.8368055555555555 | 0 |
| 0.8375 | 0 |
| 0.8381944444444445 | 0 |
| 0.8388888888888889 | 0 |
| 0.8395833333333332 | 0 |
| 0.8402777777777778 | 0 |
| 0.8409722222222222 | 0 |
| 0.8416666666666667 | 0 |
| 0.842361111111111 | 0 |
| 0.8430555555555556 | 0 |
| 0.84375 | 0 |
| 0.8444444444444444 | 0 |
| 0.845138888888889 | 0 |
| 0.8458333333333333 | 0 |
| 0.8465277777777778 | 0 |
| 0.8472222222222222 | 0 |
| 0.8479166666666668 | 0 |
| 0.8486111111111111 | 0 |
| 0.8493055555555555 | 0 |
| 0.85 | 0 |
| 0.8506944444444445 | 0 |
| 0.8513888888888889 | 0 |
| 0.8520833333333333 | 0 |
| 0.8527777777777777 | 0 |
| 0.8534722222222223 | 0 |
| 0.8541666666666666 | 0 |
| 0.8548611111111111 | 0 |
| 0.8555555555555556 | 0 |
| 0.8562500000000001 | 0 |
| 0.8569444444444444 | 0 |
| 0.8576388888888888 | 0 |
| 0.8583333333333334 | 0 |
| 0.8590277777777778 | 0 |
| 0.8597222222222222 | 0 |
| 0.8604166666666666 | 0 |
| 0.8611111111111112 | 0 |
| 0.8618055555555556 | 0 |
| 0.8624999999999999 | 0 |
| 0.8631944444444444 | 0 |
| 0.8638888888888889 | 0 |
| 0.8645833333333334 | 0 |
| 0.8652777777777777 | 0 |
| 0.8659722222222223 | 0 |
| 0.8666666666666667 | 0 |
| 0.8673611111111111 | 0 |
| 0.8680555555555555 | 0 |
| 0.86875 | 0 |
| 0.8694444444444445 | 0 |
| 0.8701388888888889 | 0 |
| 0.8708333333333332 | 0 |
| 0.8715277777777778 | 0 |
| 0.8722222222222222 | 0 |
| 0.8729166666666667 | 0 |
| 0.873611111111111 | 0 |
| 0.8743055555555556 | 0 |
| 0.875 | 0 |
| 0.8756944444444444 | 0 |
| 0.876388888888889 | 0 |
| 0.8770833333333333 | 0 |
| 0.8777777777777778 | 0 |
| 0.8784722222222222 | 0 |
| 0.8791666666666668 | 0 |
| 0.8798611111111111 | 0 |
| 0.8805555555555555 | 0 |
| 0.88125 | 0 |
| 0.8819444444444445 | 0 |
| 0.8826388888888889 | 0 |
| 0.8833333333333333 | 0 |
| 0.8840277777777777 | 0 |
| 0.8847222222222223 | 0 |
| 0.8854166666666666 | 0 |
| 0.8861111111111111 | 0 |
| 0.8868055555555556 | 0 |
| 0.8875000000000001 | 0 |
| 0.8881944444444444 | 0 |
| 0.8888888888888888 | 0 |
| 0.8895833333333334 | 0 |
| 0.8902777777777778 | 0 |
| 0.8909722222222222 | 0 |
| 0.8916666666666666 | 0 |
| 0.8923611111111112 | 0 |
| 0.8930555555555556 | 0 |
| 0.8937499999999999 | 0 |
| 0.8944444444444444 | 0 |
| 0.8951388888888889 | 0 |
| 0.8958333333333334 | 0 |
| 0.8965277777777777 | 0 |
| 0.8972222222222223 | 0 |
| 0.8979166666666667 | 0 |
| 0.8986111111111111 | 0 |
| 0.8993055555555555 | 0 |
| 0.9 | 0 |
| 0.9006944444444445 | 0 |
| 0.9013888888888889 | 0 |
| 0.9020833333333332 | 0 |
| 0.9027777777777778 | 0 |
| 0.9034722222222222 | 0 |
| 0.9041666666666667 | 0 |
| 0.904861111111111 | 0 |
| 0.9055555555555556 | 0 |
| 0.90625 | 0 |
| 0.9069444444444444 | 0 |
| 0.907638888888889 | 0 |
| 0.9083333333333333 | 0 |
| 0.9090277777777778 | 0 |
| 0.9097222222222222 | 0 |
| 0.9104166666666668 | 0 |
| 0.9111111111111111 | 0 |
| 0.9118055555555555 | 0 |
| 0.9125 | 0 |
| 0.9131944444444445 | 0 |
| 0.9138888888888889 | 0 |
| 0.9145833333333333 | 0 |
| 0.9152777777777777 | 0 |
| 0.9159722222222223 | 0 |
| 0.9166666666666666 | 0 |
| 0.9173611111111111 | 0 |
| 0.9180555555555556 | 0 |
| 0.9187500000000001 | 0 |
| 0.9194444444444444 | 0 |
| 0.9201388888888888 | 0 |
| 0.9208333333333334 | 0 |
| 0.9215277777777778 | 0 |
| 0.9222222222222222 | 0 |
| 0.9229166666666666 | 0 |
| 0.9236111111111112 | 0 |
| 0.9243055555555556 | 0 |
| 0.9249999999999999 | 0 |
| 0.9256944444444444 | 0 |
| 0.9263888888888889 | 0 |
| 0.9270833333333334 | 0 |
| 0.9277777777777777 | 0 |
| 0.9284722222222223 | 0 |
| 0.9291666666666667 | 0 |
| 0.9298611111111111 | 0 |
| 0.9305555555555555 | 0 |
| 0.93125 | 0 |
| 0.9319444444444445 | 0 |
| 0.9326388888888889 | 0 |
| 0.9333333333333332 | 0 |
| 0.9340277777777778 | 0 |
| 0.9347222222222222 | 0 |
| 0.9354166666666667 | 0 |
| 0.936111111111111 | 0 |
| 0.9368055555555556 | 0 |
| 0.9375 | 0 |
| 0.9381944444444444 | 0 |
| 0.938888888888889 | 0 |
| 0.9395833333333333 | 0 |
| 0.9402777777777778 | 0 |
| 0.9409722222222222 | 0 |
| 0.9416666666666668 | 0 |
| 0.9423611111111111 | 0 |
| 0.9430555555555555 | 0 |
| 0.94375 | 0 |
| 0.9444444444444445 | 0 |
| 0.9451388888888889 | 0 |
| 0.9458333333333333 | 0 |
| 0.9465277777777777 | 0 |
| 0.9472222222222223 | 0 |
| 0.9479166666666666 | 0 |
| 0.9486111111111111 | 0 |
| 0.9493055555555556 | 0 |
| 0.9500000000000001 | 0 |
| 0.9506944444444444 | 0 |
| 0.9513888888888888 | 0 |
| 0.9520833333333334 | 0 |
| 0.9527777777777778 | 0 |
| 0.9534722222222222 | 0 |
| 0.9541666666666666 | 0 |
| 0.9548611111111112 | 0 |
| 0.9555555555555556 | 0 |
| 0.9562499999999999 | 0 |
| 0.9569444444444444 | 0 |
| 0.9576388888888889 | 0 |
| 0.9583333333333334 | 0 |
| 0.9590277777777777 | 0 |
| 0.9597222222222223 | 0 |
| 0.9604166666666667 | 0 |
| 0.9611111111111111 | 0 |
| 0.9618055555555555 | 0 |
| 0.9625 | 0 |
| 0.9631944444444445 | 0 |
| 0.9638888888888889 | 0 |
| 0.9645833333333332 | 0 |
| 0.9652777777777778 | 0 |
| 0.9659722222222222 | 0 |
| 0.9666666666666667 | 0 |
| 0.967361111111111 | 0 |
| 0.9680555555555556 | 0 |
| 0.96875 | 0 |
| 0.9694444444444444 | 0 |
| 0.970138888888889 | 0 |
| 0.9708333333333333 | 0 |
| 0.9715277777777778 | 0 |
| 0.9722222222222222 | 0 |
| 0.9729166666666668 | 0 |
| 0.9736111111111111 | 0 |
| 0.9743055555555555 | 0 |
| 0.975 | 0 |
| 0.9756944444444445 | 0 |
| 0.9763888888888889 | 0 |
| 0.9770833333333333 | 0 |
| 0.9777777777777777 | 0 |
| 0.9784722222222223 | 0 |
| 0.9791666666666666 | 0 |
| 0.9798611111111111 | 0 |
| 0.9805555555555556 | 0 |
| 0.9812500000000001 | 0 |
| 0.9819444444444444 | 0 |
| 0.9826388888888888 | 0 |
| 0.9833333333333334 | 0 |
| 0.9840277777777778 | 0 |
| 0.9847222222222222 | 0 |
| 0.9854166666666666 | 0 |
| 0.9861111111111112 | 0 |
| 0.9868055555555556 | 0 |
| 0.9874999999999999 | 0 |
| 0.9881944444444444 | 0 |
| 0.9888888888888889 | 0 |
| 0.9895833333333334 | 0 |
| 0.9902777777777777 | 0 |
| 0.9909722222222223 | 0 |
| 0.9916666666666667 | 0 |
| 0.9923611111111111 | 0 |
| 0.9930555555555555 | 0 |
| 0.99375 | 0 |
| 0.9944444444444445 | 0 |
| 0.9951388888888889 | 0 |
| 0.9958333333333332 | 0 |
| 0.9965277777777778 | 0 |
| 0.9972222222222222 | 0 |
| 0.9979166666666667 | 0 |
| 0.998611111111111 | 0 |
| 0.9993055555555556 | 0 |